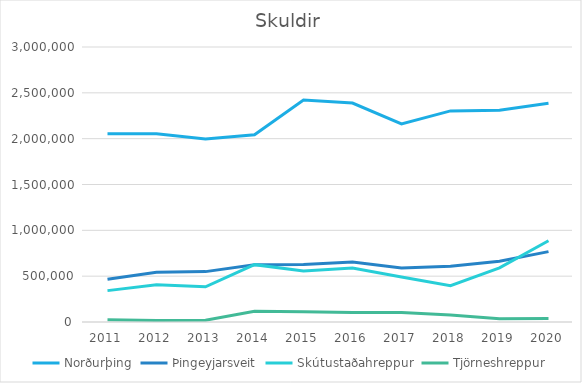
| Category | Norðurþing | Þingeyjarsveit | Skútustaðahreppur | Tjörneshreppur |
|---|---|---|---|---|
| 2011.0 | 2052437.153 | 465656.708 | 342178.756 | 24387.873 |
| 2012.0 | 2053070.182 | 542225.383 | 405690.476 | 16218.182 |
| 2013.0 | 1997307.583 | 549557.252 | 383832.884 | 19454.545 |
| 2014.0 | 2042842 | 625230 | 625463 | 117169 |
| 2015.0 | 2420963.186 | 628298.475 | 555985.294 | 111316.667 |
| 2016.0 | 2388807.627 | 654568.306 | 588520 | 104423.729 |
| 2017.0 | 2161490 | 589912 | 491639 | 103367 |
| 2018.0 | 2302925.378 | 608099.553 | 396998.008 | 77578.182 |
| 2019.0 | 2309645 | 661800 | 591099 | 36582 |
| 2020.0 | 2387251 | 767492 | 885919 | 37804 |